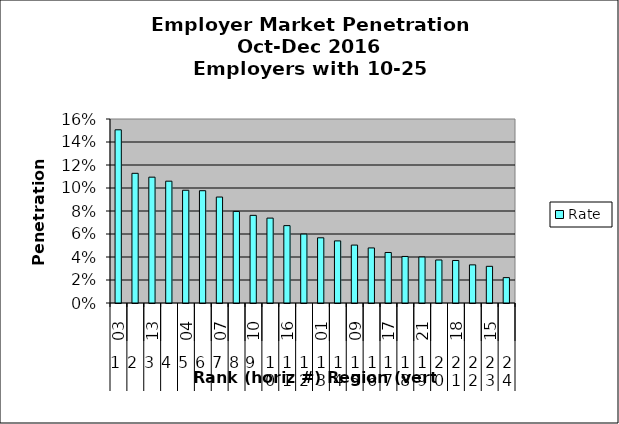
| Category | Rate |
|---|---|
| 0 | 0.151 |
| 1 | 0.113 |
| 2 | 0.109 |
| 3 | 0.106 |
| 4 | 0.098 |
| 5 | 0.098 |
| 6 | 0.092 |
| 7 | 0.08 |
| 8 | 0.076 |
| 9 | 0.074 |
| 10 | 0.067 |
| 11 | 0.06 |
| 12 | 0.057 |
| 13 | 0.054 |
| 14 | 0.05 |
| 15 | 0.048 |
| 16 | 0.044 |
| 17 | 0.04 |
| 18 | 0.04 |
| 19 | 0.037 |
| 20 | 0.037 |
| 21 | 0.033 |
| 22 | 0.032 |
| 23 | 0.022 |